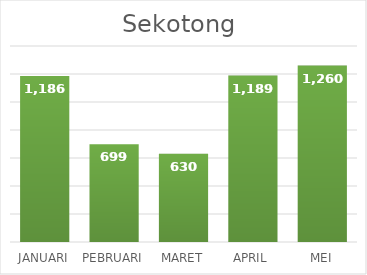
| Category |  1,186  |
|---|---|
| JANUARI | 1186 |
| PEBRUARI | 699 |
| MARET | 630 |
| APRIL | 1189 |
| MEI | 1260 |